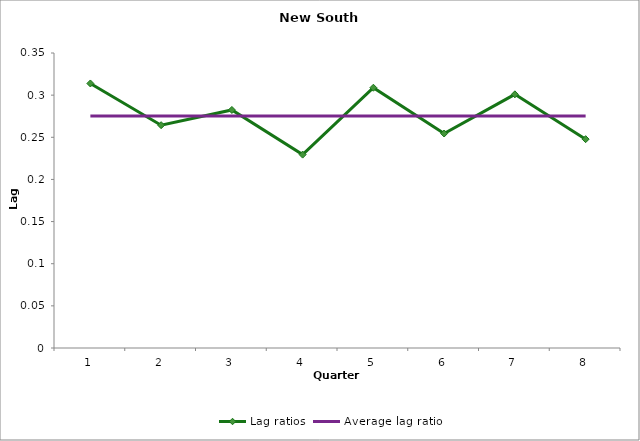
| Category | Lag ratios | Average lag ratio |
|---|---|---|
| 0 | 0.314 | 0.275 |
| 1 | 0.264 | 0.275 |
| 2 | 0.282 | 0.275 |
| 3 | 0.229 | 0.275 |
| 4 | 0.309 | 0.275 |
| 5 | 0.254 | 0.275 |
| 6 | 0.301 | 0.275 |
| 7 | 0.248 | 0.275 |